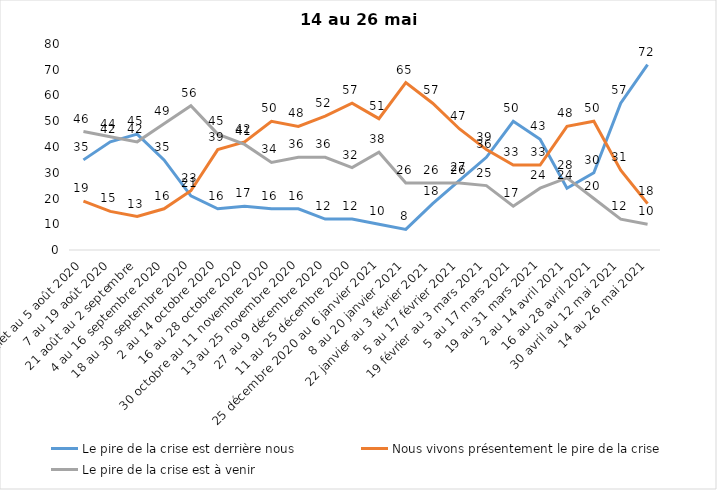
| Category | Le pire de la crise est derrière nous | Nous vivons présentement le pire de la crise | Le pire de la crise est à venir |
|---|---|---|---|
| 24 juillet au 5 août 2020 | 35 | 19 | 46 |
| 7 au 19 août 2020 | 42 | 15 | 44 |
| 21 août au 2 septembre | 45 | 13 | 42 |
| 4 au 16 septembre 2020 | 35 | 16 | 49 |
| 18 au 30 septembre 2020 | 21 | 23 | 56 |
| 2 au 14 octobre 2020 | 16 | 39 | 45 |
| 16 au 28 octobre 2020 | 17 | 42 | 41 |
| 30 octobre au 11 novembre 2020 | 16 | 50 | 34 |
| 13 au 25 novembre 2020 | 16 | 48 | 36 |
| 27 au 9 décembre 2020 | 12 | 52 | 36 |
| 11 au 25 décembre 2020 | 12 | 57 | 32 |
| 25 décembre 2020 au 6 janvier 2021 | 10 | 51 | 38 |
| 8 au 20 janvier 2021 | 8 | 65 | 26 |
| 22 janvier au 3 février 2021 | 18 | 57 | 26 |
| 5 au 17 février 2021 | 27 | 47 | 26 |
| 19 février au 3 mars 2021 | 36 | 39 | 25 |
| 5 au 17 mars 2021 | 50 | 33 | 17 |
| 19 au 31 mars 2021 | 43 | 33 | 24 |
| 2 au 14 avril 2021 | 24 | 48 | 28 |
| 16 au 28 avril 2021 | 30 | 50 | 20 |
| 30 avril au 12 mai 2021 | 57 | 31 | 12 |
| 14 au 26 mai 2021 | 72 | 18 | 10 |